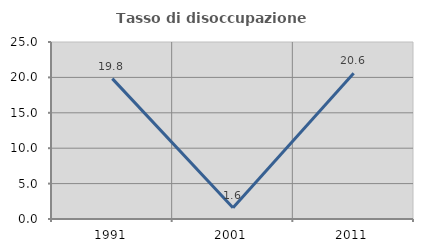
| Category | Tasso di disoccupazione giovanile  |
|---|---|
| 1991.0 | 19.828 |
| 2001.0 | 1.587 |
| 2011.0 | 20.588 |